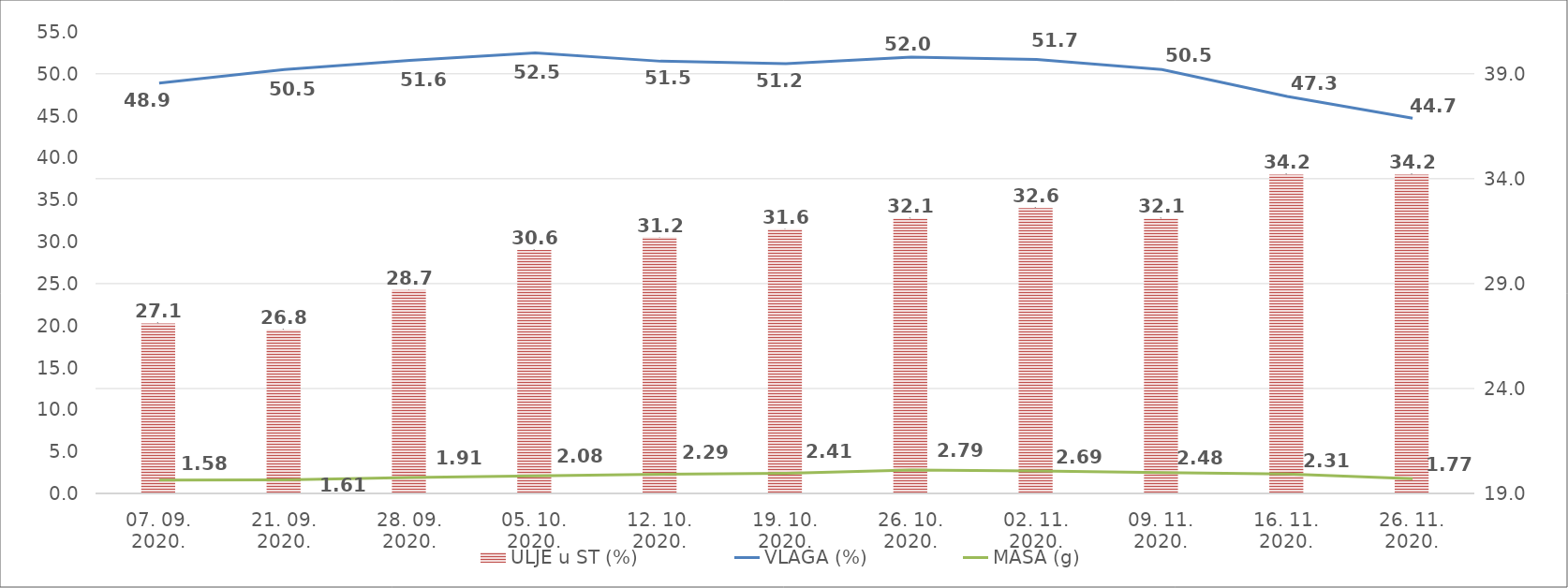
| Category | ULJE u ST (%) |
|---|---|
| 07. 09. 2020. | 27.1 |
| 21. 09. 2020. | 26.8 |
| 28. 09. 2020. | 28.7 |
| 05. 10. 2020. | 30.6 |
| 12. 10. 2020. | 31.2 |
| 19. 10. 2020. | 31.6 |
| 26. 10. 2020. | 32.1 |
| 02. 11. 2020. | 32.6 |
| 09. 11. 2020. | 32.1 |
| 16. 11. 2020. | 34.2 |
| 26. 11. 2020. | 34.2 |